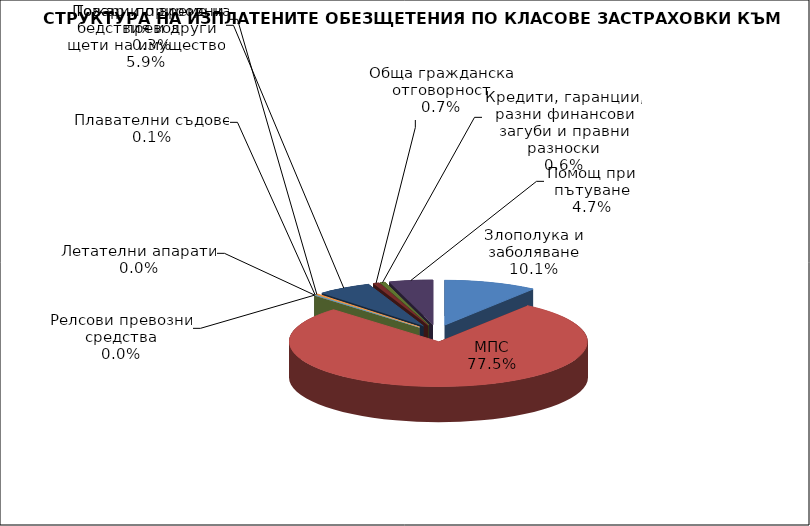
| Category | Злополука и заболяване |
|---|---|
| Злополука и заболяване | 0.101 |
| МПС | 0.775 |
| Релсови превозни средства | 0 |
| Летателни апарати | 0 |
| Плавателни съдове | 0.001 |
| Товари по време на превоз | 0.003 |
| Пожар и природни бедствия и други щети на имущество | 0.059 |
| Обща гражданска отговорност | 0.007 |
| Кредити, гаранции, разни финансови загуби и правни разноски | 0.006 |
| Помощ при пътуване | 0.047 |